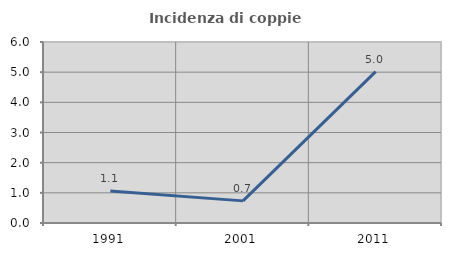
| Category | Incidenza di coppie miste |
|---|---|
| 1991.0 | 1.064 |
| 2001.0 | 0.733 |
| 2011.0 | 5.019 |